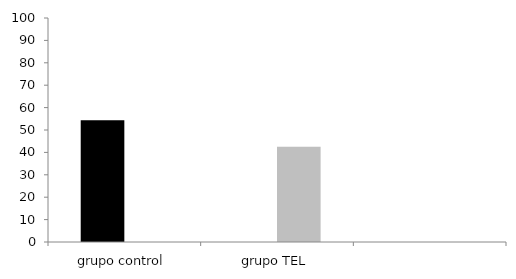
| Category | AIMPLÍCITO | Series 1 |
|---|---|---|
| grupo control | 54.375 | 0 |
| grupo TEL | 0 | 42.5 |